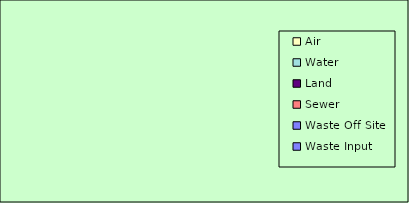
| Category | Series 0 |
|---|---|
| Air | 0 |
| Water | 0 |
| Land | 0 |
| Sewer | 0 |
| Waste Off Site | 0 |
| Waste Input | 0 |